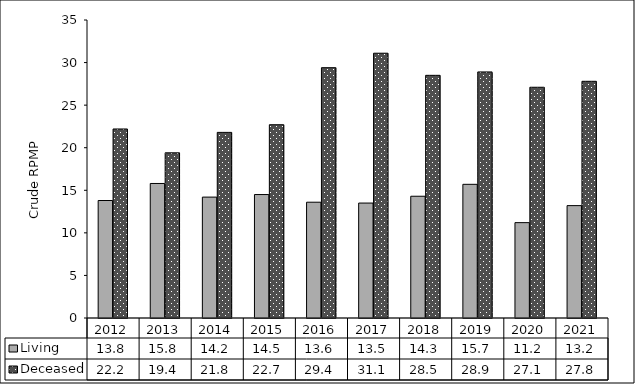
| Category | Living | Deceased |
|---|---|---|
| 2012 | 13.8 | 22.2 |
| 2013 | 15.8 | 19.4 |
| 2014 | 14.2 | 21.8 |
| 2015 | 14.5 | 22.7 |
| 2016 | 13.6 | 29.4 |
| 2017 | 13.5 | 31.1 |
| 2018 | 14.3 | 28.5 |
| 2019 | 15.7 | 28.9 |
| 2020 | 11.2 | 27.1 |
| 2021 | 13.2 | 27.8 |